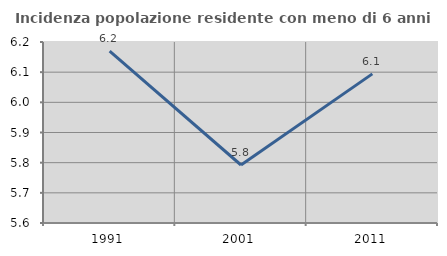
| Category | Incidenza popolazione residente con meno di 6 anni |
|---|---|
| 1991.0 | 6.17 |
| 2001.0 | 5.792 |
| 2011.0 | 6.094 |